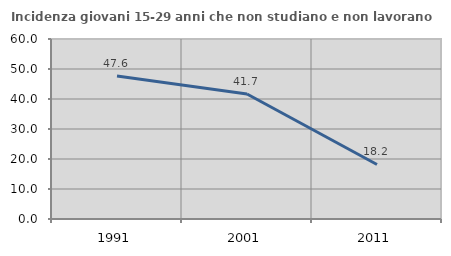
| Category | Incidenza giovani 15-29 anni che non studiano e non lavorano  |
|---|---|
| 1991.0 | 47.647 |
| 2001.0 | 41.667 |
| 2011.0 | 18.182 |